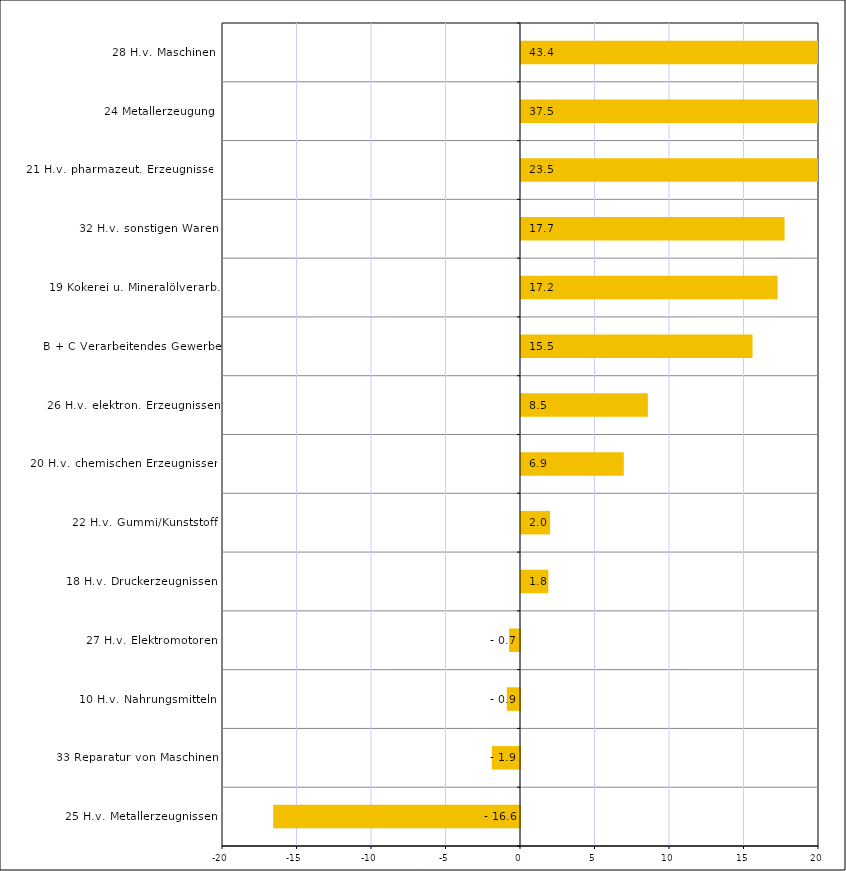
| Category | Series 0 |
|---|---|
| 25 H.v. Metallerzeugnissen | -16.561 |
| 33 Reparatur von Maschinen | -1.889 |
| 10 H.v. Nahrungsmitteln | -0.887 |
| 27 H.v. Elektromotoren | -0.732 |
| 18 H.v. Druckerzeugnissen | 1.836 |
| 22 H.v. Gummi/Kunststoff | 1.952 |
| 20 H.v. chemischen Erzeugnissen | 6.9 |
| 26 H.v. elektron. Erzeugnissen | 8.512 |
| B + C Verarbeitendes Gewerbe | 15.539 |
| 19 Kokerei u. Mineralölverarb. | 17.223 |
| 32 H.v. sonstigen Waren | 17.691 |
| 21 H.v. pharmazeut. Erzeugnissen | 23.467 |
| 24 Metallerzeugung | 37.517 |
| 28 H.v. Maschinen | 43.366 |